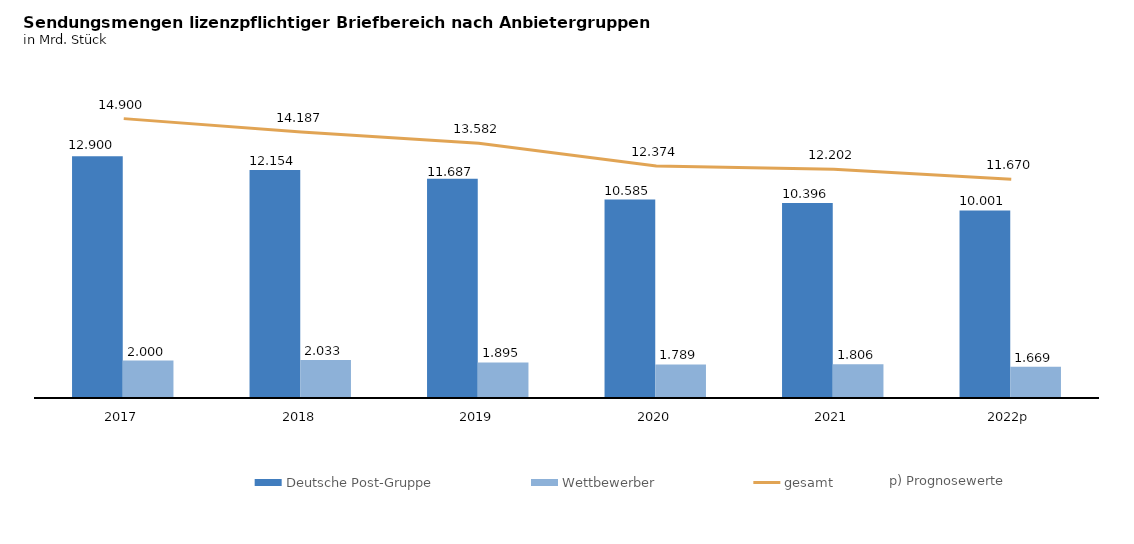
| Category | Deutsche Post-Gruppe | Wettbewerber |
|---|---|---|
| 2017 | 12.9 | 2 |
| 2018 | 12.154 | 2.033 |
| 2019 | 11.687 | 1.895 |
| 2020 | 10.585 | 1.789 |
| 2021 | 10.396 | 1.806 |
| 2022p | 10.001 | 1.669 |